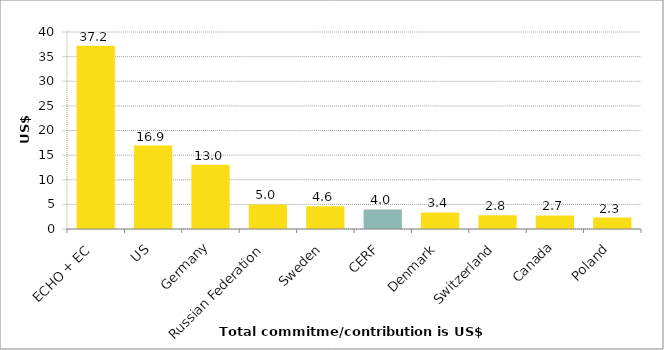
| Category | Total commitment/contribution in US$ millions |
|---|---|
| ECHO + EC | 37.219 |
| US | 16.943 |
| Germany | 13.049 |
| Russian Federation | 5 |
| Sweden | 4.643 |
| CERF | 3.975 |
| Denmark | 3.368 |
| Switzerland | 2.787 |
| Canada | 2.746 |
| Poland | 2.32 |